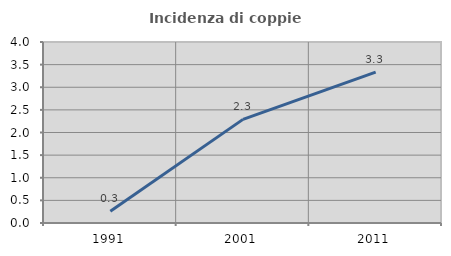
| Category | Incidenza di coppie miste |
|---|---|
| 1991.0 | 0.26 |
| 2001.0 | 2.29 |
| 2011.0 | 3.333 |